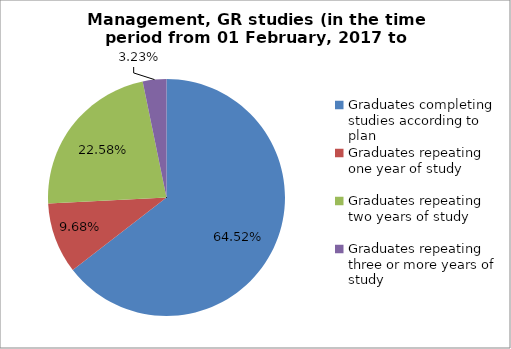
| Category | Series 0 |
|---|---|
| Graduates completing studies according to plan | 64.516 |
| Graduates repeating one year of study | 9.677 |
| Graduates repeating two years of study | 22.581 |
| Graduates repeating three or more years of study | 3.226 |